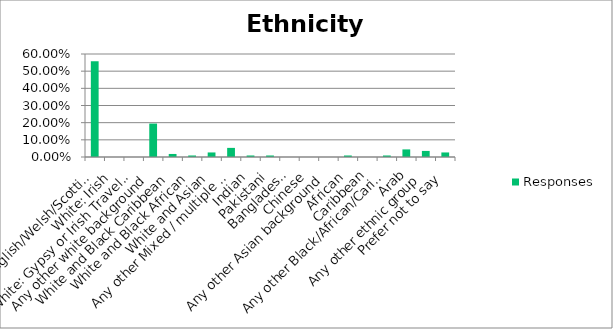
| Category | Responses |
|---|---|
| White: English/Welsh/Scottish/Northern Irish/British | 0.558 |
| White: Irish | 0 |
| White: Gypsy or Irish Traveller | 0 |
| Any other white background | 0.195 |
| White and Black Caribbean | 0.018 |
| White and Black African | 0.009 |
| White and Asian | 0.026 |
| Any other Mixed / multiple ethnic background | 0.053 |
| Indian | 0.009 |
| Pakistani | 0.009 |
| Bangladeshi | 0 |
| Chinese | 0 |
| Any other Asian background | 0 |
| African | 0.009 |
| Caribbean | 0 |
| Any other Black/African/Caribbean background | 0.009 |
| Arab | 0.044 |
| Any other ethnic group | 0.035 |
| Prefer not to say | 0.026 |